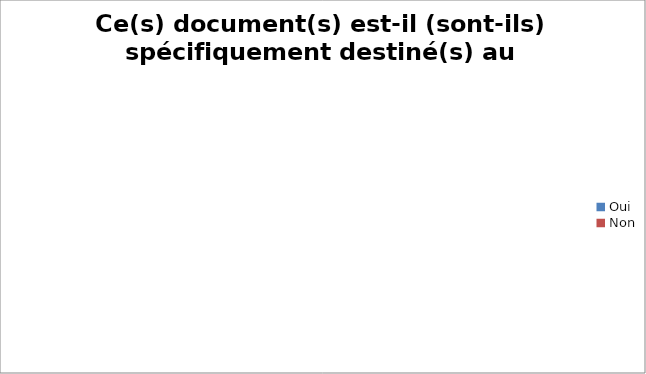
| Category | Ce(s) document(s) est-il (sont-ils) spécifiquement destiné(s) au patient ? |
|---|---|
| Oui | 0 |
| Non | 0 |